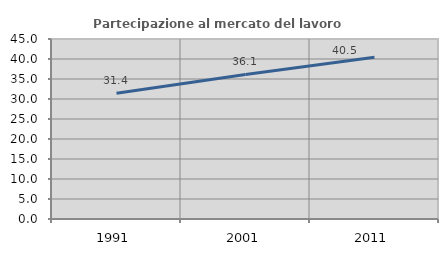
| Category | Partecipazione al mercato del lavoro  femminile |
|---|---|
| 1991.0 | 31.434 |
| 2001.0 | 36.138 |
| 2011.0 | 40.461 |